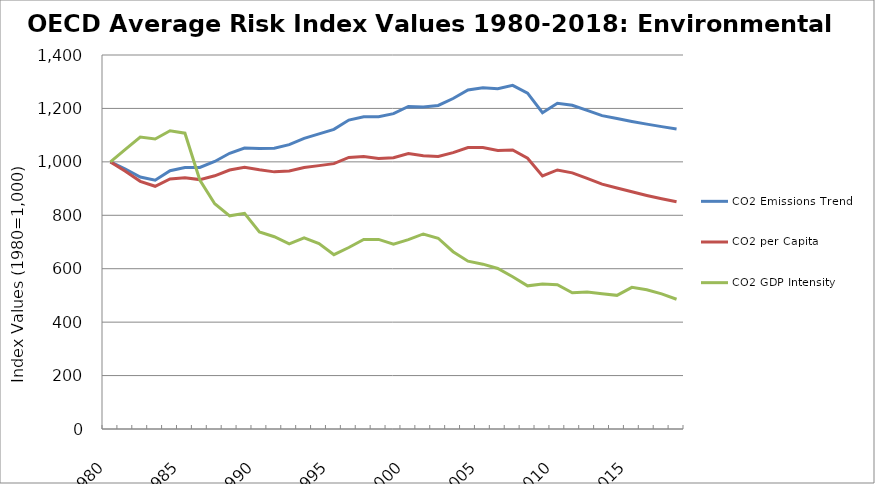
| Category | CO2 Emissions Trend | CO2 per Capita | CO2 GDP Intensity |
|---|---|---|---|
| 1980.0 | 1000 | 1000 | 1000 |
| 1981.0 | 973.357 | 964.84 | 1046.386 |
| 1982.0 | 943.154 | 927.177 | 1092.986 |
| 1983.0 | 931.483 | 908.527 | 1085.757 |
| 1984.0 | 966.717 | 935.887 | 1116.442 |
| 1985.0 | 979.072 | 940.811 | 1107.269 |
| 1986.0 | 979.009 | 933.565 | 932.02 |
| 1987.0 | 1001.46 | 947.797 | 843.304 |
| 1988.0 | 1032.055 | 969.366 | 797.912 |
| 1989.0 | 1051.68 | 979.94 | 807.498 |
| 1990.0 | 1050.392 | 970.519 | 737.378 |
| 1991.0 | 1051.325 | 962.53 | 719.649 |
| 1992.0 | 1064.277 | 965.699 | 692.955 |
| 1993.0 | 1088.194 | 979.065 | 715.468 |
| 1994.0 | 1104.587 | 985.901 | 694.104 |
| 1995.0 | 1121.564 | 993.277 | 652.611 |
| 1996.0 | 1156.398 | 1016.487 | 679.436 |
| 1997.0 | 1168.854 | 1019.871 | 709.38 |
| 1998.0 | 1168.929 | 1012.746 | 709.797 |
| 1999.0 | 1180.542 | 1015.608 | 692.203 |
| 2000.0 | 1207.162 | 1031.375 | 708.73 |
| 2001.0 | 1205.633 | 1022.685 | 730.109 |
| 2002.0 | 1211.266 | 1020.043 | 714.055 |
| 2003.0 | 1237.158 | 1034.43 | 663.595 |
| 2004.0 | 1269.072 | 1053.566 | 628.23 |
| 2005.0 | 1277.792 | 1053.342 | 616.971 |
| 2006.0 | 1274.069 | 1042.609 | 600.949 |
| 2007.0 | 1286.173 | 1044.742 | 569.675 |
| 2008.0 | 1257.166 | 1013.325 | 535.961 |
| 2009.0 | 1183.734 | 947.436 | 542.994 |
| 2010.0 | 1219.388 | 969.618 | 540.12 |
| 2011.0 | 1212.02 | 958.937 | 510.12 |
| 2012.0 | 1192.932 | 938.037 | 512.443 |
| 2013.0 | 1172.958 | 916.473 | 506.101 |
| 2014.0 | 1162.062 | 901.985 | 500.341 |
| 2015.0 | 1151.223 | 887.808 | 530.285 |
| 2016.0 | 1141.16 | 874.334 | 521.344 |
| 2017.0 | 1131.871 | 862.157 | 505.693 |
| 2018.0 | 1123.353 | 850.821 | 485.8 |